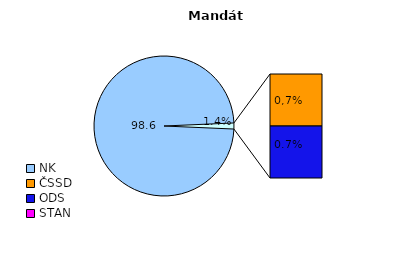
| Category | Series 0 |
|---|---|
| NK | 143 |
| ČSSD | 1 |
| ODS | 1 |
| STAN | 0 |